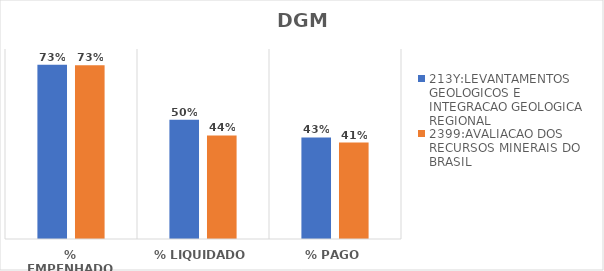
| Category | 213Y:LEVANTAMENTOS GEOLOGICOS E INTEGRACAO GEOLOGICA REGIONAL | 2399:AVALIACAO DOS RECURSOS MINERAIS DO BRASIL |
|---|---|---|
| % EMPENHADO | 0.733 | 0.732 |
| % LIQUIDADO | 0.502 | 0.436 |
| % PAGO | 0.427 | 0.406 |